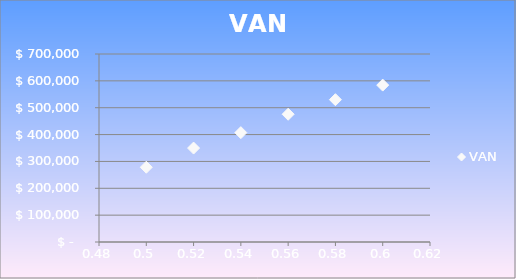
| Category | VAN |
|---|---|
| 0.5 | 278355.668 |
| 0.52 | 349747.035 |
| 0.54 | 407180.845 |
| 0.56 | 475648.162 |
| 0.58 | 529905.601 |
| 0.6 | 584163.041 |